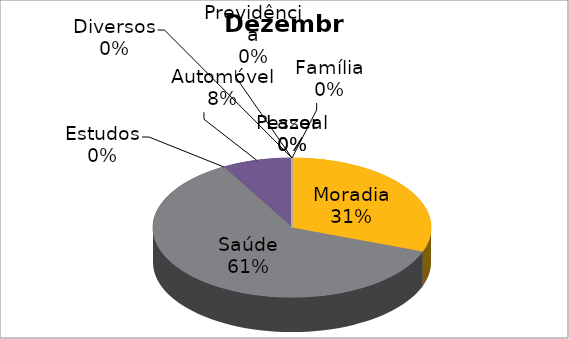
| Category | Dezembro | Janeiro |
|---|---|---|
| Moradia | 1500 | 4020 |
| Saúde | 3000 | 100 |
| Estudos | 0 | 680 |
| Automóvel | 400 | 1230 |
| Pessoal | 0 | 640 |
| Lazer | 0 | 400 |
| Família | 0 | 700 |
| Previdência | 0 | 0 |
| Diversos | 0 | 0 |